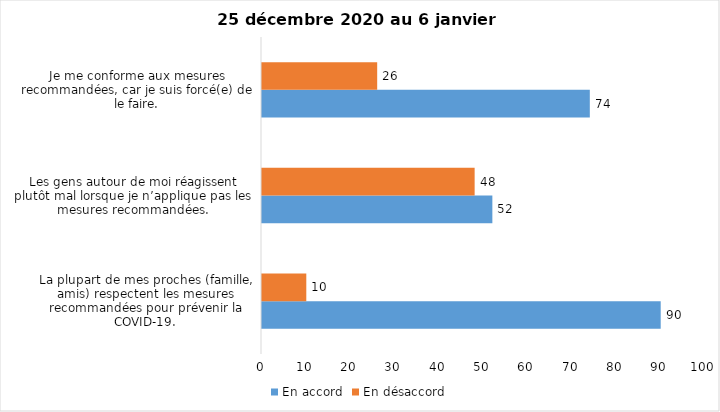
| Category | En accord | En désaccord |
|---|---|---|
| La plupart de mes proches (famille, amis) respectent les mesures recommandées pour prévenir la COVID-19. | 90 | 10 |
| Les gens autour de moi réagissent plutôt mal lorsque je n’applique pas les mesures recommandées. | 52 | 48 |
| Je me conforme aux mesures recommandées, car je suis forcé(e) de le faire. | 74 | 26 |